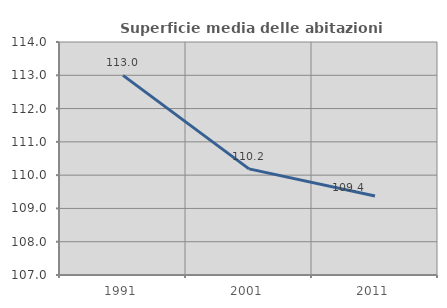
| Category | Superficie media delle abitazioni occupate |
|---|---|
| 1991.0 | 112.999 |
| 2001.0 | 110.188 |
| 2011.0 | 109.374 |